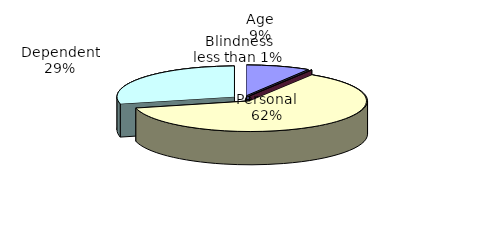
| Category | Series 0 |
|---|---|
| Age | 721972 |
| Blindness | 9891 |
| Personal | 5123327 |
| Dependent | 2362760 |